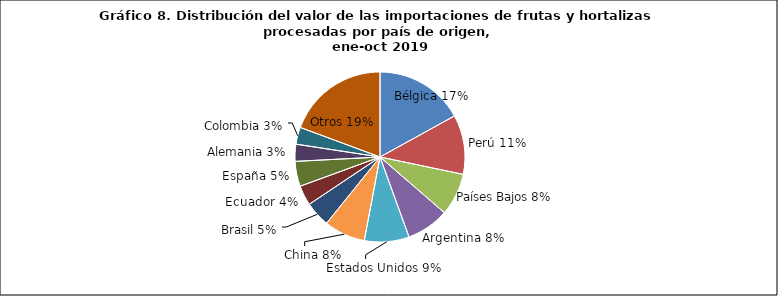
| Category | Series 0 |
|---|---|
| Bélgica | 55885923.22 |
| Perú | 37170553.73 |
| Países Bajos | 26570030.3 |
| Argentina | 26681685.18 |
| Estados Unidos | 27981985.78 |
| China | 25824721.03 |
| Brasil | 15836456.45 |
| Ecuador | 12477744.07 |
| España | 15681121.91 |
| Alemania | 10659906.37 |
| Colombia | 10644521.79 |
| Otros | 63679413.01 |